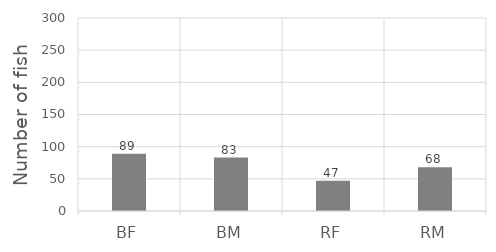
| Category | Series 0 |
|---|---|
| BF | 89 |
| BM | 83 |
| RF | 47 |
| RM | 68 |